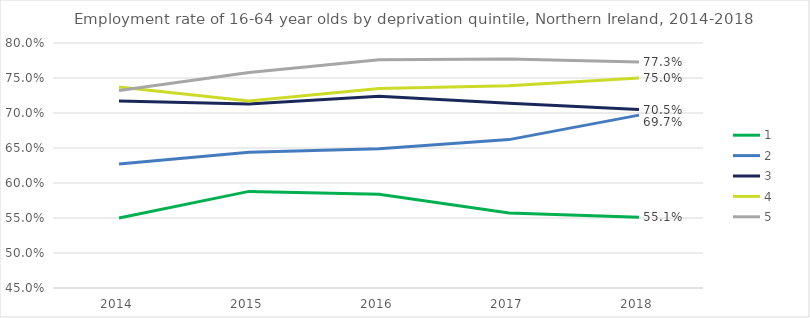
| Category | 1 | 2 | 3 | 4 | 5 |
|---|---|---|---|---|---|
| 2014 | 0.55 | 0.627 | 0.717 | 0.737 | 0.732 |
| 2015 | 0.588 | 0.644 | 0.713 | 0.717 | 0.758 |
| 2016 | 0.584 | 0.649 | 0.724 | 0.735 | 0.776 |
| 2017 | 0.557 | 0.662 | 0.714 | 0.739 | 0.777 |
| 2018 | 0.551 | 0.697 | 0.705 | 0.75 | 0.773 |